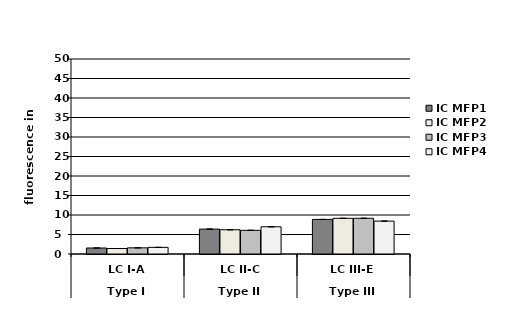
| Category | IC MFP1 | IC MFP2 | IC MFP3 | IC MFP4 |
|---|---|---|---|---|
| 0 | 1.54 | 1.41 | 1.58 | 1.7 |
| 1 | 6.38 | 6.22 | 6.07 | 6.98 |
| 2 | 8.87 | 9.15 | 9.16 | 8.43 |